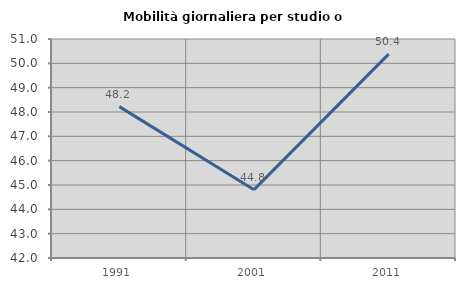
| Category | Mobilità giornaliera per studio o lavoro |
|---|---|
| 1991.0 | 48.222 |
| 2001.0 | 44.808 |
| 2011.0 | 50.379 |